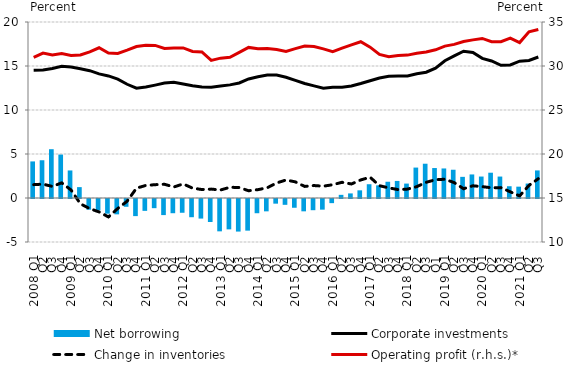
| Category | Net borrowing |
|---|---|
| 2008 Q1 | 4.156 |
| Q2 | 4.29 |
| Q3 | 5.545 |
| Q4 | 4.935 |
| 2009 Q1 | 3.13 |
| Q2 | 1.236 |
| Q3 | -1.214 |
| Q4 | -1.287 |
| 2010 Q1 | -1.668 |
| Q2 | -1.744 |
| Q3 | -0.885 |
| Q4 | -1.945 |
| 2011 Q1 | -1.349 |
| Q2 | -1.042 |
| Q3 | -1.828 |
| Q4 | -1.616 |
| 2012 Q1 | -1.564 |
| Q2 | -2.071 |
| Q3 | -2.225 |
| Q4 | -2.613 |
| 2013 Q1 | -3.675 |
| Q2 | -3.449 |
| Q3 | -3.702 |
| Q4 | -3.595 |
| 2014 Q1 | -1.617 |
| Q2 | -1.403 |
| Q3 | -0.53 |
| Q4 | -0.662 |
| 2015 Q1 | -0.995 |
| Q2 | -1.401 |
| Q3 | -1.273 |
| Q4 | -1.209 |
| 2016 Q1 | -0.47 |
| Q2 | 0.358 |
| Q3 | 0.522 |
| Q4 | 0.871 |
| 2017 Q1 | 1.565 |
| Q2 | 1.436 |
| Q3 | 1.847 |
| Q4 | 1.939 |
| 2018 Q1 | 1.638 |
| Q2 | 3.457 |
| Q3 | 3.895 |
| Q1 | 3.405 |
| 2019 Q1 | 3.358 |
| Q2 | 3.212 |
| Q3 | 2.404 |
| Q4 | 2.678 |
| 2020 Q1 | 2.438 |
| Q2 | 2.874 |
| Q3 | 2.437 |
| Q4 | 1.337 |
|  2021 Q1 | 1.289 |
| Q2 | 1.643 |
| Q3 | 3.133 |